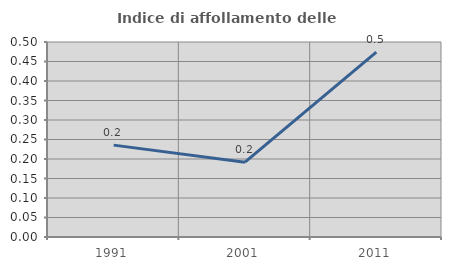
| Category | Indice di affollamento delle abitazioni  |
|---|---|
| 1991.0 | 0.236 |
| 2001.0 | 0.192 |
| 2011.0 | 0.474 |